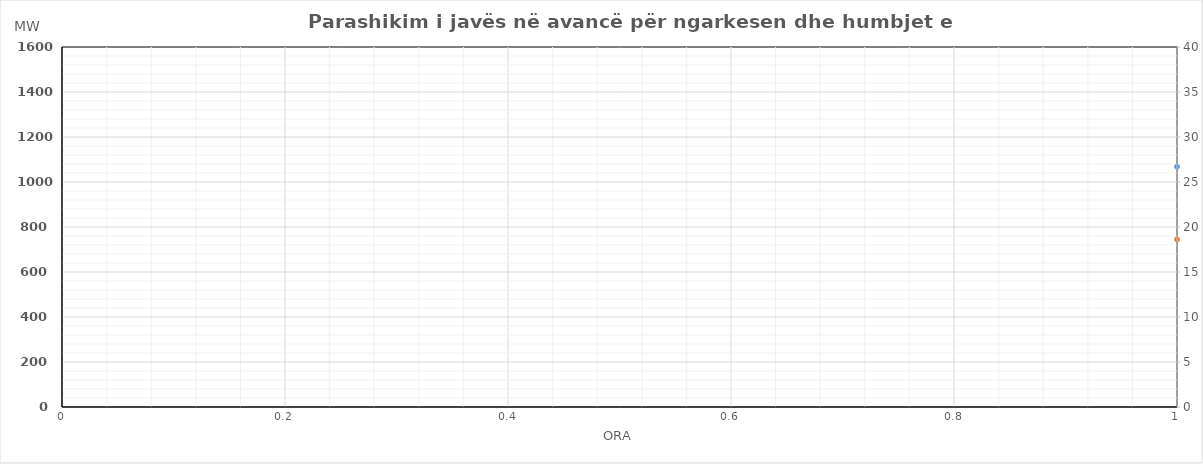
| Category | Ngarkesa (MWh) |
|---|---|
| 0 | 745.078 |
| 1 | 636.235 |
| 2 | 587.384 |
| 3 | 573.699 |
| 4 | 583.834 |
| 5 | 651.078 |
| 6 | 839.073 |
| 7 | 1114.375 |
| 8 | 1220.298 |
| 9 | 1221.774 |
| 10 | 1179.207 |
| 11 | 1165.153 |
| 12 | 1162.404 |
| 13 | 1187.175 |
| 14 | 1216.046 |
| 15 | 1228.977 |
| 16 | 1269.475 |
| 17 | 1393.854 |
| 18 | 1434.436 |
| 19 | 1425.221 |
| 20 | 1380.757 |
| 21 | 1246.186 |
| 22 | 1065.472 |
| 23 | 867.02 |
| 24 | 756.008 |
| 25 | 662.271 |
| 26 | 603.995 |
| 27 | 583.33 |
| 28 | 589.601 |
| 29 | 653.861 |
| 30 | 843.611 |
| 31 | 1123.233 |
| 32 | 1248.405 |
| 33 | 1260.351 |
| 34 | 1234.994 |
| 35 | 1211.625 |
| 36 | 1216.092 |
| 37 | 1231.197 |
| 38 | 1234.298 |
| 39 | 1229.152 |
| 40 | 1252.788 |
| 41 | 1373.325 |
| 42 | 1413.013 |
| 43 | 1402.934 |
| 44 | 1368.074 |
| 45 | 1249.885 |
| 46 | 1064.518 |
| 47 | 865.766 |
| 48 | 712.895 |
| 49 | 643.274 |
| 50 | 607.194 |
| 51 | 591.873 |
| 52 | 606.331 |
| 53 | 670.747 |
| 54 | 848.954 |
| 55 | 1116.693 |
| 56 | 1223.231 |
| 57 | 1240.62 |
| 58 | 1202.341 |
| 59 | 1189.731 |
| 60 | 1206.178 |
| 61 | 1236.905 |
| 62 | 1246.852 |
| 63 | 1246.489 |
| 64 | 1278.715 |
| 65 | 1390.832 |
| 66 | 1435.354 |
| 67 | 1423.348 |
| 68 | 1381.337 |
| 69 | 1261.152 |
| 70 | 1084.93 |
| 71 | 894.033 |
| 72 | 782.509 |
| 73 | 691.115 |
| 74 | 632.148 |
| 75 | 609.2 |
| 76 | 614.194 |
| 77 | 677.165 |
| 78 | 834.501 |
| 79 | 1081.612 |
| 80 | 1236.221 |
| 81 | 1286.735 |
| 82 | 1284.145 |
| 83 | 1271.376 |
| 84 | 1298.138 |
| 85 | 1322.203 |
| 86 | 1281.672 |
| 87 | 1263.967 |
| 88 | 1298.482 |
| 89 | 1413.481 |
| 90 | 1441.191 |
| 91 | 1432.336 |
| 92 | 1398.393 |
| 93 | 1278.166 |
| 94 | 1103.215 |
| 95 | 932.267 |
| 96 | 800.501 |
| 97 | 695.088 |
| 98 | 634.407 |
| 99 | 611.108 |
| 100 | 611.604 |
| 101 | 660.924 |
| 102 | 798.503 |
| 103 | 1033.703 |
| 104 | 1176.249 |
| 105 | 1229.187 |
| 106 | 1215.923 |
| 107 | 1203.347 |
| 108 | 1202.75 |
| 109 | 1216.27 |
| 110 | 1225.643 |
| 111 | 1243.405 |
| 112 | 1306.362 |
| 113 | 1447.863 |
| 114 | 1499.868 |
| 115 | 1500.199 |
| 116 | 1472.802 |
| 117 | 1354.195 |
| 118 | 1168.74 |
| 119 | 966.1 |
| 120 | 804.371 |
| 121 | 698.307 |
| 122 | 637.251 |
| 123 | 613.809 |
| 124 | 614.308 |
| 125 | 663.932 |
| 126 | 802.36 |
| 127 | 1039.013 |
| 128 | 1182.438 |
| 129 | 1235.703 |
| 130 | 1222.358 |
| 131 | 1209.704 |
| 132 | 1209.103 |
| 133 | 1222.706 |
| 134 | 1232.138 |
| 135 | 1250.009 |
| 136 | 1313.355 |
| 137 | 1455.729 |
| 138 | 1508.056 |
| 139 | 1508.388 |
| 140 | 1480.823 |
| 141 | 1361.483 |
| 142 | 1174.883 |
| 143 | 970.992 |
| 144 | 823.201 |
| 145 | 718.818 |
| 146 | 652.747 |
| 147 | 627.229 |
| 148 | 628.865 |
| 149 | 681.887 |
| 150 | 831.745 |
| 151 | 1077.939 |
| 152 | 1217.887 |
| 153 | 1264.185 |
| 154 | 1250.61 |
| 155 | 1241.183 |
| 156 | 1247.063 |
| 157 | 1262.715 |
| 158 | 1269.403 |
| 159 | 1279.633 |
| 160 | 1332.049 |
| 161 | 1464.959 |
| 162 | 1509.872 |
| 163 | 1507.431 |
| 164 | 1477.17 |
| 165 | 1357.812 |
| 166 | 1169.44 |
| 167 | 967.335 |